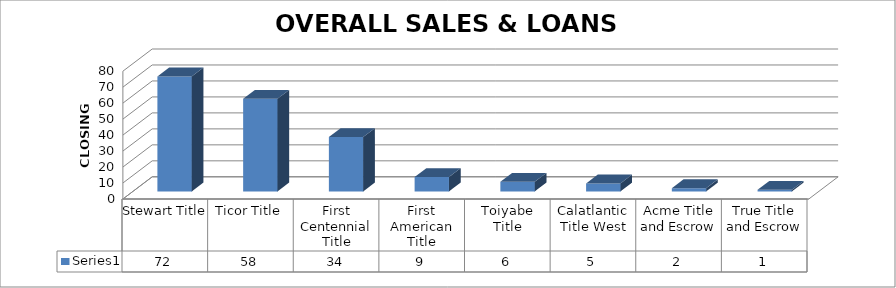
| Category | Series 0 |
|---|---|
| Stewart Title | 72 |
| Ticor Title | 58 |
| First Centennial Title | 34 |
| First American Title | 9 |
| Toiyabe Title | 6 |
| Calatlantic Title West | 5 |
| Acme Title and Escrow | 2 |
| True Title and Escrow | 1 |